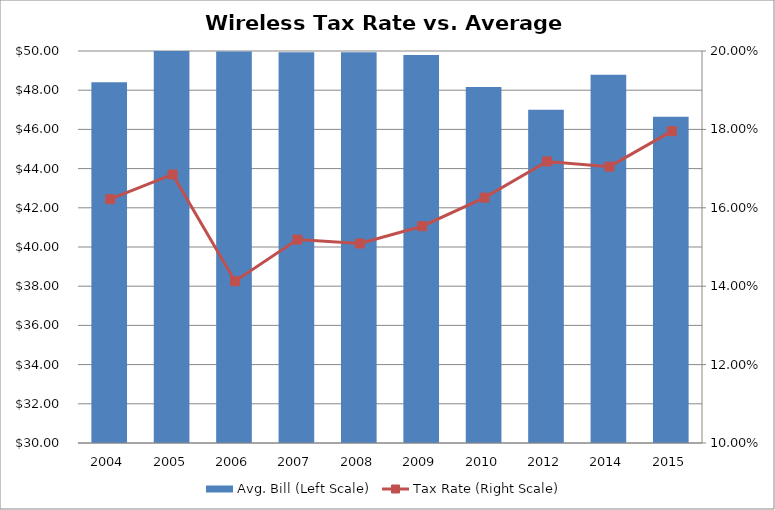
| Category | Avg. Bill (Left Scale) |
|---|---|
| 2004.0 | 48.4 |
| 2005.0 | 50.64 |
| 2006.0 | 49.98 |
| 2007.0 | 49.94 |
| 2008.0 | 49.94 |
| 2009.0 | 49.79 |
| 2010.0 | 48.16 |
| 2012.0 | 47 |
| 2014.0 | 48.79 |
| 2015.0 | 46.64 |